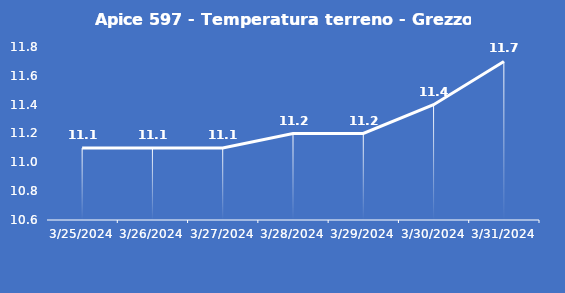
| Category | Apice 597 - Temperatura terreno - Grezzo (°C) |
|---|---|
| 3/25/24 | 11.1 |
| 3/26/24 | 11.1 |
| 3/27/24 | 11.1 |
| 3/28/24 | 11.2 |
| 3/29/24 | 11.2 |
| 3/30/24 | 11.4 |
| 3/31/24 | 11.7 |